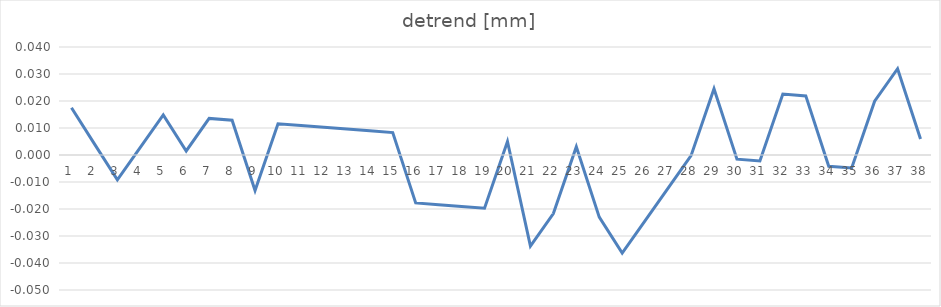
| Category | detrend [mm] |
|---|---|
| 0 | 0.017 |
| 1 | 0.004 |
| 2 | -0.009 |
| 3 | 0.003 |
| 4 | 0.015 |
| 5 | 0.002 |
| 6 | 0.014 |
| 7 | 0.013 |
| 8 | -0.013 |
| 9 | 0.012 |
| 10 | 0.011 |
| 11 | 0.01 |
| 12 | 0.01 |
| 13 | 0.009 |
| 14 | 0.008 |
| 15 | -0.018 |
| 16 | -0.018 |
| 17 | -0.019 |
| 18 | -0.02 |
| 19 | 0.005 |
| 20 | -0.034 |
| 21 | -0.022 |
| 22 | 0.003 |
| 23 | -0.023 |
| 24 | -0.036 |
| 25 | -0.024 |
| 26 | -0.012 |
| 27 | 0 |
| 28 | 0.025 |
| 29 | -0.002 |
| 30 | -0.002 |
| 31 | 0.023 |
| 32 | 0.022 |
| 33 | -0.004 |
| 34 | -0.005 |
| 35 | 0.02 |
| 36 | 0.032 |
| 37 | 0.006 |